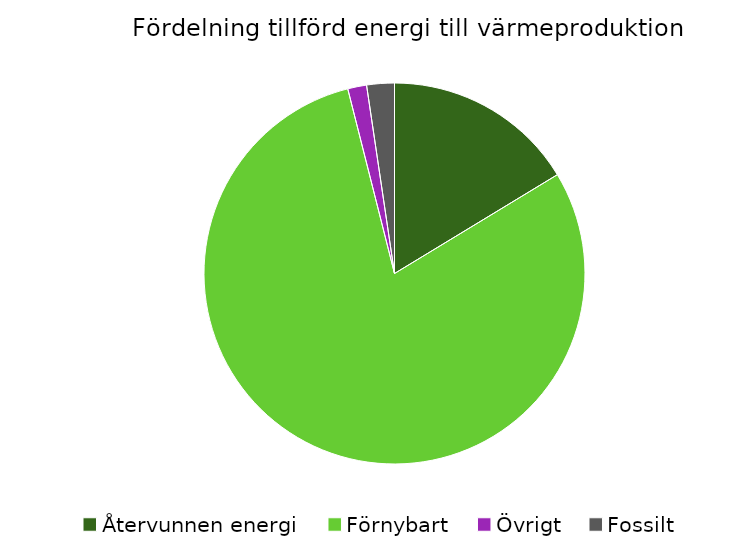
| Category | Fördelning värmeproduktion |
|---|---|
| Återvunnen energi | 0.163 |
| Förnybart | 0.797 |
| Övrigt | 0.016 |
| Fossilt | 0.023 |